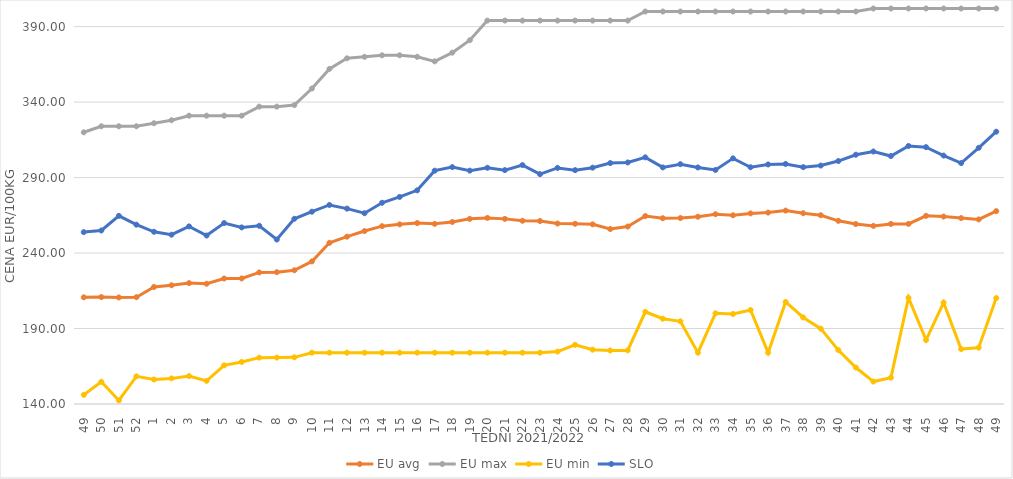
| Category | EU avg | EU max | EU min | SLO |
|---|---|---|---|---|
| 49.0 | 210.677 | 320 | 146.064 | 253.87 |
| 50.0 | 210.823 | 324 | 154.698 | 254.94 |
| 51.0 | 210.59 | 324 | 142.382 | 264.65 |
| 52.0 | 210.763 | 324 | 158.333 | 258.8 |
| 1.0 | 217.519 | 326 | 156.222 | 254.09 |
| 2.0 | 218.654 | 328 | 156.969 | 252.15 |
| 3.0 | 220.098 | 331 | 158.511 | 257.65 |
| 4.0 | 219.685 | 331 | 155.346 | 251.6 |
| 5.0 | 223.143 | 331 | 165.59 | 259.87 |
| 6.0 | 223.178 | 331 | 167.86 | 256.97 |
| 7.0 | 227.145 | 337 | 170.719 | 258.07 |
| 8.0 | 227.312 | 337 | 170.743 | 248.97 |
| 9.0 | 228.588 | 338 | 170.92 | 262.72 |
| 10.0 | 234.434 | 349 | 174 | 267.38 |
| 11.0 | 246.762 | 362 | 174 | 271.86 |
| 12.0 | 250.845 | 369 | 174 | 269.43 |
| 13.0 | 254.568 | 370 | 174 | 266.39 |
| 14.0 | 257.819 | 371 | 174 | 273.3 |
| 15.0 | 259 | 371 | 174 | 277.18 |
| 16.0 | 259.873 | 370 | 174 | 281.55 |
| 17.0 | 259.351 | 367 | 174 | 294.59 |
| 18.0 | 260.6 | 372.758 | 174 | 296.93 |
| 19.0 | 262.669 | 381 | 174 | 294.6 |
| 20.0 | 263.291 | 394 | 174 | 296.48 |
| 21.0 | 262.64 | 394 | 174 | 294.94 |
| 22.0 | 261.388 | 394 | 174 | 298.26 |
| 23.0 | 261.228 | 394 | 174 | 292.27 |
| 24.0 | 259.544 | 394 | 174.72 | 296.39 |
| 25.0 | 259.395 | 394 | 179.2 | 294.93 |
| 26.0 | 259.018 | 394 | 176 | 296.56 |
| 27.0 | 255.922 | 394 | 175.451 | 299.59 |
| 28.0 | 257.564 | 394 | 175.52 | 300.01 |
| 29.0 | 264.52 | 400 | 201.097 | 303.41 |
| 30.0 | 263.067 | 400 | 196.496 | 296.73 |
| 31.0 | 263.196 | 400 | 194.756 | 298.88 |
| 32.0 | 264.059 | 400 | 174 | 296.7 |
| 33.0 | 265.729 | 400 | 200.07 | 295.05 |
| 34.0 | 265.016 | 400 | 199.637 | 302.73 |
| 35.0 | 266.273 | 400 | 202.277 | 296.86 |
| 36.0 | 266.807 | 400 | 174 | 298.7 |
| 37.0 | 268.136 | 400 | 207.594 | 299.02 |
| 38.0 | 266.39 | 400 | 197.352 | 296.91 |
| 39.0 | 265.059 | 400 | 189.926 | 297.96 |
| 40.0 | 261.35 | 400 | 175.723 | 300.95 |
| 41.0 | 259.216 | 400 | 164.165 | 305.13 |
| 42.0 | 258.007 | 402 | 154.869 | 307.26 |
| 43.0 | 259.298 | 402 | 157.459 | 304.27 |
| 44.0 | 259.315 | 402 | 210.415 | 310.93 |
| 45.0 | 264.644 | 402 | 182.35 | 310.16 |
| 46.0 | 264.186 | 402 | 207.247 | 304.58 |
| 47.0 | 263.159 | 402 | 176.378 | 299.59 |
| 48.0 | 262.268 | 402 | 177.332 | 309.69 |
| 49.0 | 267.789 | 402 | 210.19 | 320.38 |